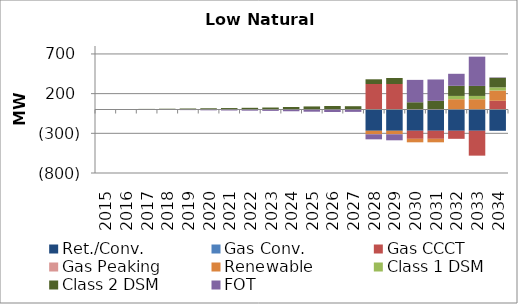
| Category | Ret./Conv. | Gas Conv. | Gas CCCT | Gas Peaking | Renewable | Class 1 DSM | Class 2 DSM | FOT |
|---|---|---|---|---|---|---|---|---|
| 2015.0 | 0 | 0 | 0 | 0 | 0 | 0 | 4.41 | -2.276 |
| 2016.0 | 0 | 0 | 0 | 0 | 0 | 0 | 4.87 | -2.439 |
| 2017.0 | 0 | 0 | 0 | 0 | 0 | 0 | 7.53 | -3.427 |
| 2018.0 | 0 | 0 | 0 | 0 | 0 | 0 | 9.66 | -4.175 |
| 2019.0 | 0 | 0 | 0 | 0 | 0 | 0 | 12.45 | -7.732 |
| 2020.0 | 0 | 0 | 0 | 0 | 0 | 0 | 15.37 | -10.341 |
| 2021.0 | 0 | 0 | 0 | 0 | 0 | 0 | 18.19 | -12.436 |
| 2022.0 | 0 | 0 | 0 | 0 | 0 | 0 | 21.32 | -14.716 |
| 2023.0 | 0 | 0 | 0 | 0 | 0 | 0 | 24.93 | -17.422 |
| 2024.0 | 0 | 0 | 0 | 0 | 0 | 0 | 31.39 | -22.241 |
| 2025.0 | 0 | 0 | 0 | 0 | 0 | 0 | 38.7 | -27.811 |
| 2026.0 | 0 | 0 | 0 | 0 | 0 | 0 | 43.78 | -31.794 |
| 2027.0 | 0 | 0 | 0 | 0 | 0 | 0 | 41.48 | -29.912 |
| 2028.0 | -268 | 0 | 321.6 | 0 | -44 | 0 | 58.86 | -63.838 |
| 2029.0 | -268 | 0 | 321.6 | 0 | -44 | 0 | 75.09 | -76.009 |
| 2030.0 | -268 | 0 | -101.4 | 0 | -44 | 0 | 91.36 | 281.831 |
| 2031.0 | -268 | 0 | -101.4 | 0 | -44 | 0 | 109.03 | 269.156 |
| 2032.0 | -268 | 0 | -101.4 | 0 | 129.622 | 41.39 | 127.25 | 151.651 |
| 2033.0 | -268 | 0 | -313.4 | 0 | 129.622 | 41.39 | 125.95 | 368.875 |
| 2034.0 | -268 | 0 | 109.6 | 0 | 129.622 | 40.04 | 120.98 | 4.428 |